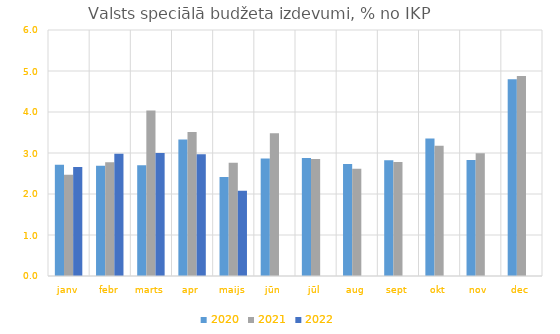
| Category | 2020 | 2021 | 2022 |
|---|---|---|---|
| janv | 2.713 | 2.468 | 2.659 |
| febr | 2.689 | 2.775 | 2.982 |
| marts | 2.701 | 4.038 | 3.002 |
| apr | 3.327 | 3.515 | 2.971 |
| maijs | 2.412 | 2.763 | 2.079 |
| jūn | 2.868 | 3.484 | 0 |
| jūl | 2.876 | 2.854 | 0 |
| aug | 2.731 | 2.615 | 0 |
| sept | 2.821 | 2.782 | 0 |
| okt | 3.357 | 3.177 | 0 |
| nov | 2.827 | 2.992 | 0 |
| dec | 4.801 | 4.876 | 0 |